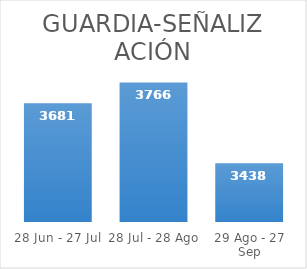
| Category | Series 0 |
|---|---|
| 28 Jun - 27 Jul | 3681 |
| 28 Jul - 28 Ago | 3766 |
| 29 Ago - 27 Sep | 3438 |